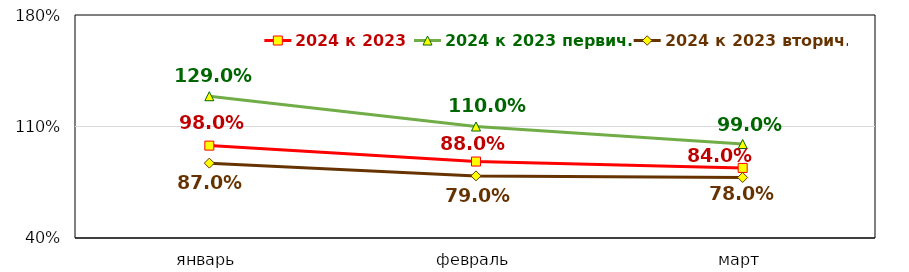
| Category | 2024 к 2023 | 2024 к 2023 первич. | 2024 к 2023 вторич. |
|---|---|---|---|
| январь | 0.98 | 1.29 | 0.87 |
| февраль | 0.88 | 1.1 | 0.79 |
| март | 0.84 | 0.99 | 0.78 |